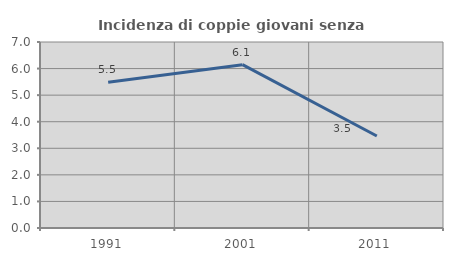
| Category | Incidenza di coppie giovani senza figli |
|---|---|
| 1991.0 | 5.485 |
| 2001.0 | 6.147 |
| 2011.0 | 3.464 |